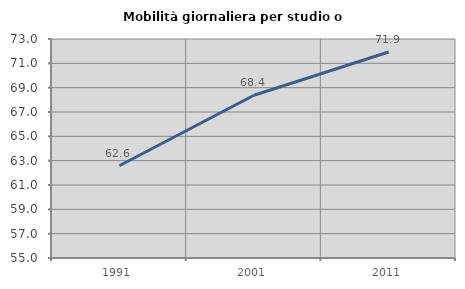
| Category | Mobilità giornaliera per studio o lavoro |
|---|---|
| 1991.0 | 62.585 |
| 2001.0 | 68.38 |
| 2011.0 | 71.931 |